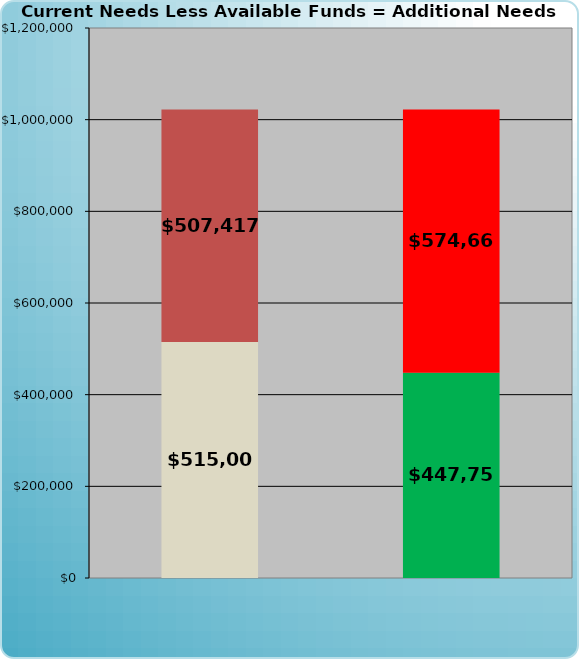
| Category | Series 0 | Series 1 |
|---|---|---|
| 0 | 515000 | 507417.276 |
| 1 | 447755 | 574662.276 |